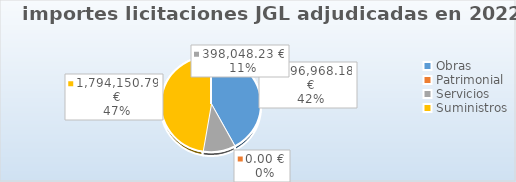
| Category | Series 0 |
|---|---|
| Obras | 1596968.18 |
| Patrimonial | 0 |
| Servicios | 398048.23 |
| Suministros | 1794150.79 |